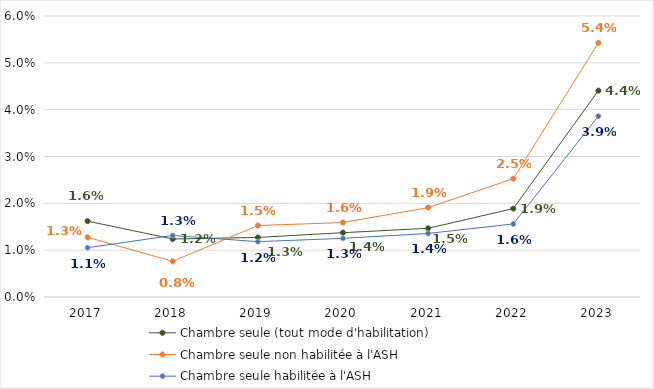
| Category | Chambre seule (tout mode d'habilitation) | Chambre seule non habilitée à l'ASH | Chambre seule habilitée à l'ASH |
|---|---|---|---|
| 2017 | 0.016 | 0.013 | 0.011 |
| 2018 | 0.012 | 0.008 | 0.013 |
| 2019 | 0.013 | 0.015 | 0.012 |
| 2020 | 0.014 | 0.016 | 0.013 |
| 2021 | 0.015 | 0.019 | 0.014 |
| 2022 | 0.019 | 0.025 | 0.016 |
| 2023 | 0.044 | 0.054 | 0.039 |